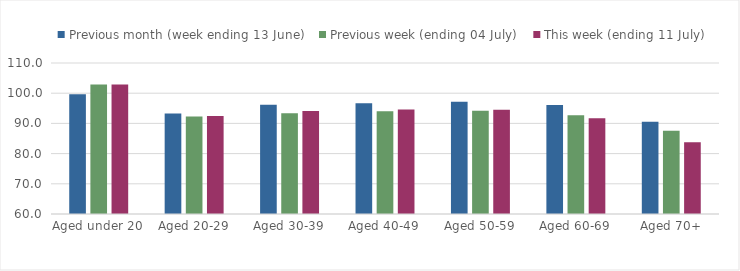
| Category | Previous month (week ending 13 June) | Previous week (ending 04 July) | This week (ending 11 July) |
|---|---|---|---|
| Aged under 20 | 99.637 | 102.876 | 102.867 |
| Aged 20-29 | 93.313 | 92.256 | 92.412 |
| Aged 30-39 | 96.201 | 93.373 | 94.133 |
| Aged 40-49 | 96.7 | 93.995 | 94.598 |
| Aged 50-59 | 97.166 | 94.187 | 94.546 |
| Aged 60-69 | 96.098 | 92.711 | 91.676 |
| Aged 70+ | 90.564 | 87.576 | 83.732 |